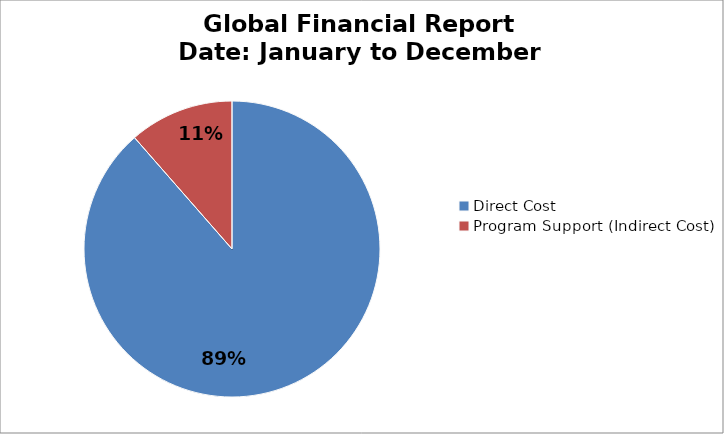
| Category | Total Expenses |
|---|---|
| Direct Cost | 135700.06 |
| Program Support (Indirect Cost) | 17537.59 |